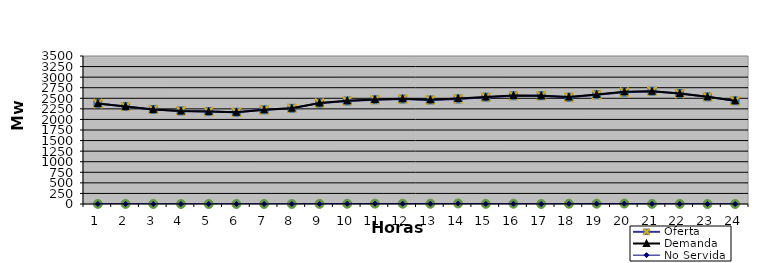
| Category | Oferta | No Servida | Demanda |
|---|---|---|---|
| 1.0 | 2376.24 | 2 | 2378.24 |
| 2.0 | 2305.03 | 2 | 2307.03 |
| 3.0 | 2235.82 | 0 | 2235.82 |
| 4.0 | 2201.25 | 0 | 2201.25 |
| 5.0 | 2185 | 0.25 | 2185.25 |
| 6.0 | 2168.56 | 0.24 | 2168.8 |
| 7.0 | 2227.32 | 0.24 | 2227.56 |
| 8.0 | 2262.89 | 0.24 | 2263.13 |
| 9.0 | 2385.35 | 2.36 | 2387.71 |
| 10.0 | 2435.67 | 5.77 | 2441.44 |
| 11.0 | 2465.71 | 8.31 | 2474.02 |
| 12.0 | 2480.88 | 6.81 | 2487.69 |
| 13.0 | 2459.77 | 6.19 | 2465.96 |
| 14.0 | 2483.78 | 12.53 | 2496.31 |
| 15.0 | 2526.79 | 2.69 | 2529.48 |
| 16.0 | 2559.25 | 6.37 | 2565.62 |
| 17.0 | 2560.68 | 0 | 2560.68 |
| 18.0 | 2524.23 | 6.012 | 2530.242 |
| 19.0 | 2583.82 | 6.68 | 2590.5 |
| 20.0 | 2643.22 | 9.26 | 2652.48 |
| 21.0 | 2666.11 | 2.54 | 2668.65 |
| 22.0 | 2612.64 | 1.52 | 2614.16 |
| 23.0 | 2534.14 | 0 | 2534.14 |
| 24.0 | 2442.07 | 0 | 2442.07 |